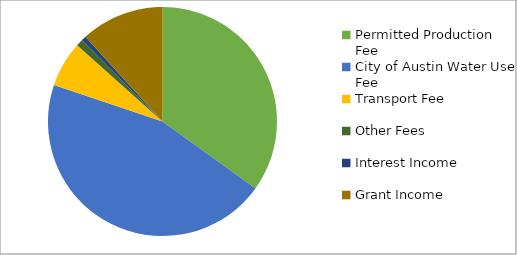
| Category | Series 0 |
|---|---|
| Permitted Production Fee | 672296 |
| City of Austin Water Use Fee | 870501 |
| Transport Fee | 124000 |
| Other Fees | 18650 |
| Interest Income | 13000 |
| Grant Income | 226157 |